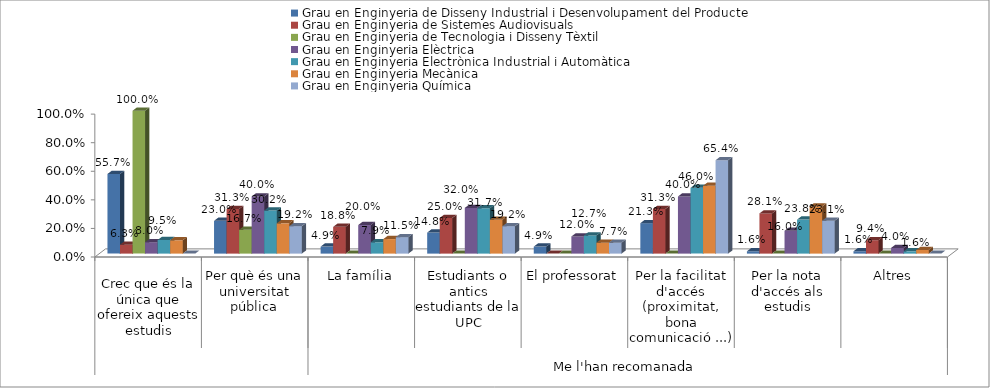
| Category | Grau en Enginyeria de Disseny Industrial i Desenvolupament del Producte | Grau en Enginyeria de Sistemes Audiovisuals | Grau en Enginyeria de Tecnologia i Disseny Tèxtil | Grau en Enginyeria Elèctrica | Grau en Enginyeria Electrònica Industrial i Automàtica | Grau en Enginyeria Mecànica | Grau en Enginyeria Química |
|---|---|---|---|---|---|---|---|
| 0 | 0.557 | 0.062 | 1 | 0.08 | 0.095 | 0.093 | 0 |
| 1 | 0.23 | 0.312 | 0.167 | 0.4 | 0.302 | 0.212 | 0.192 |
| 2 | 0.049 | 0.188 | 0 | 0.2 | 0.079 | 0.102 | 0.115 |
| 3 | 0.148 | 0.25 | 0 | 0.32 | 0.317 | 0.237 | 0.192 |
| 4 | 0.049 | 0 | 0 | 0.12 | 0.127 | 0.076 | 0.077 |
| 5 | 0.213 | 0.312 | 0 | 0.4 | 0.46 | 0.475 | 0.654 |
| 6 | 0.016 | 0.281 | 0 | 0.16 | 0.238 | 0.331 | 0.231 |
| 7 | 0.016 | 0.094 | 0 | 0.04 | 0.016 | 0.025 | 0 |